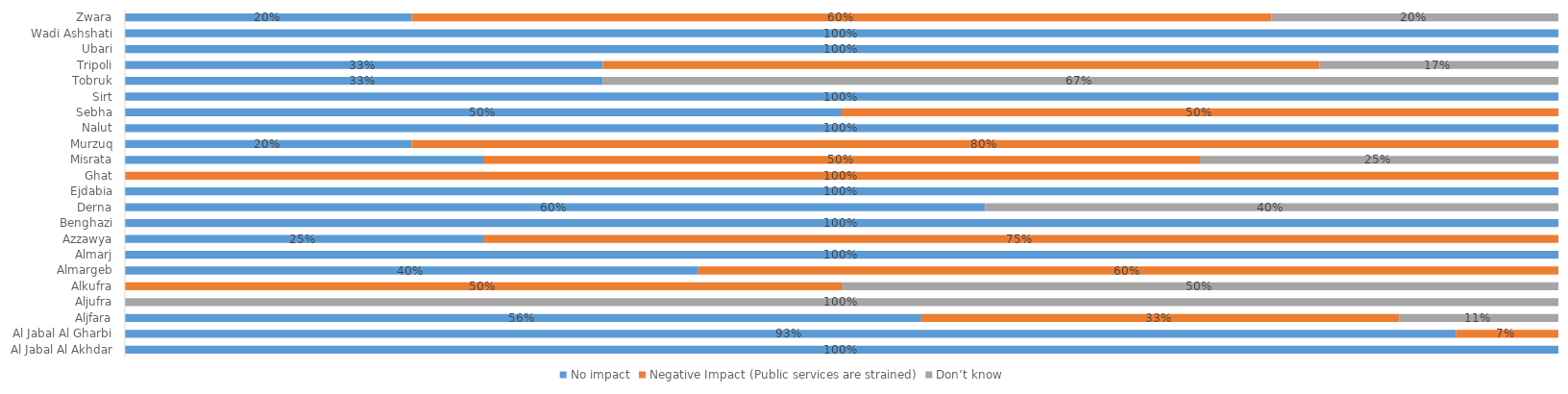
| Category | No impact | Negative Impact (Public services are strained) | Don’t know |
|---|---|---|---|
| Al Jabal Al Akhdar | 1 | 0 | 0 |
| Al Jabal Al Gharbi | 0.929 | 0.071 | 0 |
| Aljfara | 0.556 | 0.333 | 0.111 |
| Aljufra | 0 | 0 | 1 |
| Alkufra | 0 | 0.5 | 0.5 |
| Almargeb | 0.4 | 0.6 | 0 |
| Almarj | 1 | 0 | 0 |
| Azzawya | 0.25 | 0.75 | 0 |
| Benghazi | 1 | 0 | 0 |
| Derna | 0.6 | 0 | 0.4 |
| Ejdabia | 1 | 0 | 0 |
| Ghat | 0 | 1 | 0 |
| Misrata | 0.25 | 0.5 | 0.25 |
| Murzuq | 0.2 | 0.8 | 0 |
| Nalut | 1 | 0 | 0 |
| Sebha | 0.5 | 0.5 | 0 |
| Sirt | 1 | 0 | 0 |
| Tobruk | 0.333 | 0 | 0.667 |
| Tripoli | 0.333 | 0.5 | 0.167 |
| Ubari | 1 | 0 | 0 |
| Wadi Ashshati | 1 | 0 | 0 |
| Zwara | 0.2 | 0.6 | 0.2 |